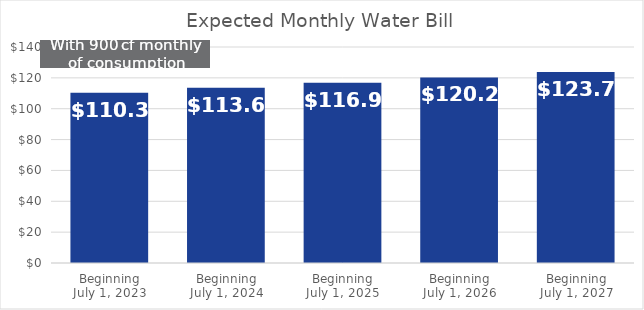
| Category | Total |
|---|---|
| Beginning
July 1, 2023 | 110.385 |
| Beginning
July 1, 2024 | 113.6 |
| Beginning
July 1, 2025 | 116.895 |
| Beginning
July 1, 2026 | 120.275 |
| Beginning
July 1, 2027 | 123.75 |